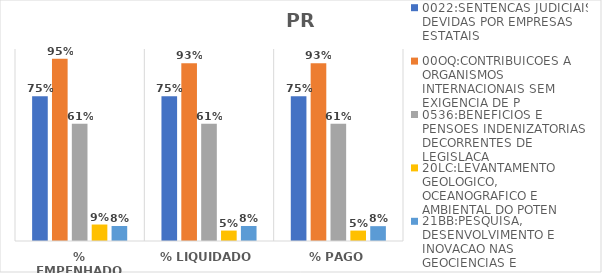
| Category | 0022:SENTENCAS JUDICIAIS DEVIDAS POR EMPRESAS ESTATAIS | 00OQ:CONTRIBUICOES A ORGANISMOS INTERNACIONAIS SEM EXIGENCIA DE P | 0536:BENEFICIOS E PENSOES INDENIZATORIAS DECORRENTES DE LEGISLACA | 20LC:LEVANTAMENTO GEOLOGICO, OCEANOGRAFICO E AMBIENTAL DO POTEN | 21BB:PESQUISA, DESENVOLVIMENTO E INOVACAO NAS GEOCIENCIAS E |
|---|---|---|---|---|---|
| % EMPENHADO | 0.754 | 0.95 | 0.611 | 0.086 | 0.078 |
| % LIQUIDADO | 0.754 | 0.926 | 0.611 | 0.054 | 0.078 |
| % PAGO | 0.754 | 0.926 | 0.611 | 0.054 | 0.077 |